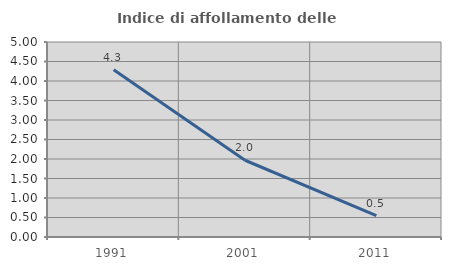
| Category | Indice di affollamento delle abitazioni  |
|---|---|
| 1991.0 | 4.29 |
| 2001.0 | 1.968 |
| 2011.0 | 0.547 |